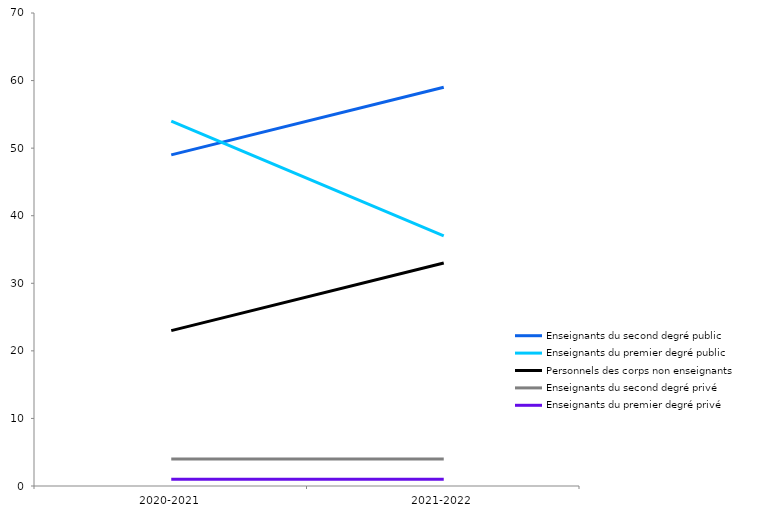
| Category | Enseignants du second degré public | Enseignants du premier degré public | Personnels des corps non enseignants  | Enseignants du second degré privé | Enseignants du premier degré privé |
|---|---|---|---|---|---|
| 2020-2021 | 49 | 54 | 23 | 4 | 1 |
| 2021-2022 | 59 | 37 | 33 | 4 | 1 |